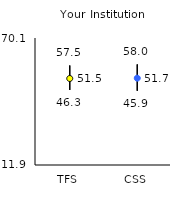
| Category | 25th | 75th | Mean |
|---|---|---|---|
| TFS | 46.3 | 57.5 | 51.54 |
| CSS | 45.9 | 58 | 51.69 |